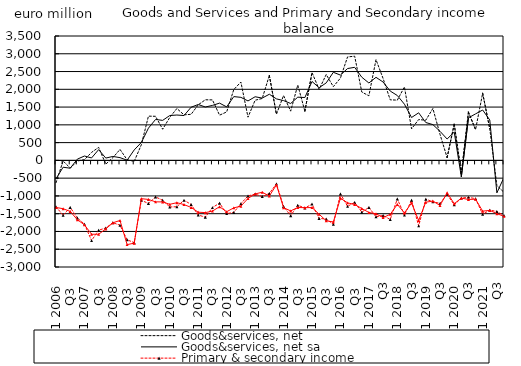
| Category | Goods&services, net | Goods&services, net sa | Primary & secondary income | Primary & secondary income sa |
|---|---|---|---|---|
| Q1 2006 | -627.255 | -515.082 | -1306.517 | -1325.025 |
| Q2  | -17.266 | -192.509 | -1543.248 | -1359.29 |
| Q3  | -216.386 | -220.043 | -1322.951 | -1436.301 |
| Q4  | -17.32 | 34.997 | -1619.741 | -1669.673 |
| Q1 2007 | 20.37 | 122.897 | -1792.899 | -1812.74 |
| Q2  | 225.275 | 68.594 | -2255.191 | -2078.773 |
| Q3  | 366.387 | 303.188 | -1964.617 | -2077.939 |
| Q4  | -106.069 | 65.321 | -1901.356 | -1929.219 |
| Q1 2008 | 76.434 | 110.795 | -1753.841 | -1755.996 |
| Q2  | 308.748 | 76.924 | -1823.11 | -1690.072 |
| Q3  | 17.744 | 4.435 | -2234.499 | -2370.064 |
| Q4  | -27.273 | 294.728 | -2314.553 | -2328.779 |
| Q1 2009 | 439.087 | 503.678 | -1124.42 | -1077.299 |
| Q2  | 1244.786 | 906.97 | -1211.143 | -1098.614 |
| Q3  | 1240.534 | 1151.37 | -1028.513 | -1166.216 |
| Q4  | 876.436 | 1125.788 | -1121.321 | -1169.109 |
| Q1 2010 | 1210.149 | 1262.118 | -1312.145 | -1236.541 |
| Q2  | 1459.38 | 1276.213 | -1303.476 | -1189.467 |
| Q3  | 1281.268 | 1261.961 | -1119.148 | -1244.056 |
| Q4  | 1296.178 | 1495.768 | -1240.582 | -1323.13 |
| Q1 2011 | 1563.857 | 1572.919 | -1537.426 | -1457.299 |
| Q2  | 1705.126 | 1501.838 | -1597.944 | -1470.162 |
| Q3  | 1701.997 | 1546.967 | -1327.078 | -1426.301 |
| Q4  | 1272.05 | 1611.559 | -1203.226 | -1304.636 |
| Q1 2012 | 1363.647 | 1505.239 | -1497.673 | -1444.876 |
| Q2  | 1992.403 | 1794.903 | -1464.037 | -1335.658 |
| Q3  | 2204.625 | 1773.742 | -1217.56 | -1288.335 |
| Q4  | 1215.539 | 1672.593 | -999.669 | -1071.225 |
| Q1 2013 | 1692.901 | 1790.438 | -948.311 | -943.902 |
| Q2  | 1741.411 | 1753.133 | -1018.019 | -896.361 |
| Q3  | 2389.757 | 1861.003 | -928.455 | -1000.538 |
| Q4  | 1299.146 | 1730.781 | -658.304 | -688.634 |
| Q1 2014 | 1825.255 | 1682.629 | -1294.558 | -1331.164 |
| Q2  | 1385.017 | 1601.015 | -1556.171 | -1420.817 |
| Q3  | 2118.665 | 1779.132 | -1261.544 | -1325.905 |
| Q4  | 1383.368 | 1768.326 | -1339.852 | -1330.239 |
| Q1 2015 | 2471.505 | 2220.926 | -1230.699 | -1327.013 |
| Q2  | 1997.257 | 2043.87 | -1632.495 | -1514.423 |
| Q3  | 2415.693 | 2180.974 | -1649.816 | -1700.074 |
| Q4 | 2074.559 | 2478.681 | -1797.882 | -1732.601 |
| Q1 2016 | 2316.174 | 2400.277 | -944.282 | -1065.141 |
| Q2  | 2911.439 | 2584.612 | -1292.804 | -1194.546 |
| Q3  | 2932.263 | 2618.664 | -1180.67 | -1241.434 |
| Q4 | 1923.911 | 2340.763 | -1456.697 | -1353.312 |
| Q1 2017 | 1817.25 | 2177.49 | -1322.518 | -1466.407 |
| Q2  | 2834.263 | 2337.513 | -1587.525 | -1501.552 |
| Q3 | 2303.416 | 2203.932 | -1549.033 | -1609.091 |
| Q4 | 1703.655 | 1950.937 | -1663.592 | -1516.659 |
| Q1 2018 | 1696.014 | 1825.054 | -1084.373 | -1238.704 |
| Q2  | 2067.362 | 1580.571 | -1537.71 | -1477.384 |
| Q3 | 887.113 | 1206.313 | -1119.637 | -1202.026 |
| Q4 | 1149.446 | 1338.912 | -1842.297 | -1689.765 |
| Q1 2019 | 1129.966 | 1065.762 | -1091.434 | -1176.643 |
| Q2  | 1460.196 | 1006.562 | -1163.313 | -1145.115 |
| Q3 | 733.905 | 818.077 | -1210.522 | -1269.146 |
| Q4 | 78.887 | 601.226 | -955.735 | -909.979 |
| Q1 2020 | 1018.736 | 796.721 | -1248.678 | -1219.219 |
| Q2  | -373.243 | -464.289 | -1061.722 | -1062.116 |
| Q3 | 1357.574 | 1196.641 | -1040.28 | -1100.112 |
| Q4 | 865.983 | 1308.641 | -1076.82 | -1091.81 |
| Q1 2021 | 1890.784 | 1417.373 | -1516.929 | -1428.552 |
| Q2  | 889.248 | 1136.813 | -1398.934 | -1406.785 |
| Q3 | -710.298 | -914.21 | -1437.229 | -1499.756 |
| Q4 | -899.316 | -478.405 | -1553.103 | -1572.992 |